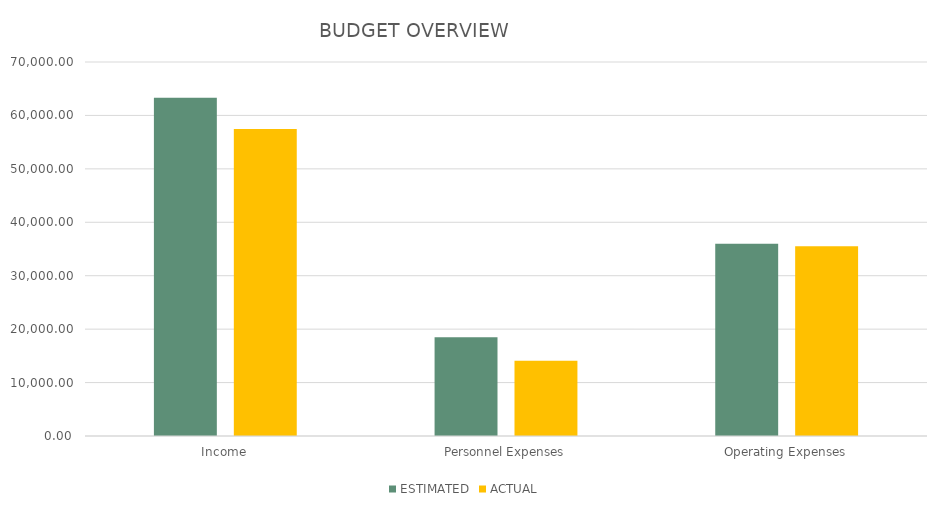
| Category | ESTIMATED | ACTUAL |
|---|---|---|
| Income | 63300 | 57450 |
| Personnel Expenses | 18500 | 14100 |
| Operating Expenses | 36000 | 35530 |